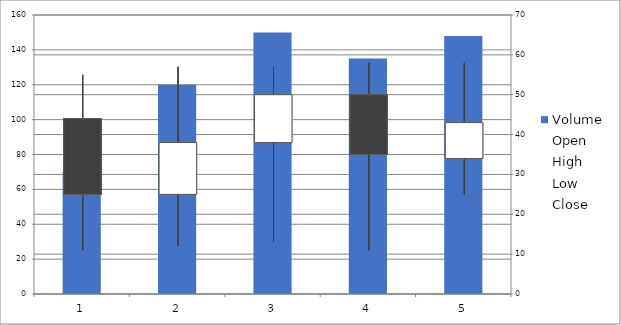
| Category | Volume |
|---|---|
| 1900-01-01 | 70 |
| 1900-01-02 | 120 |
| 1900-01-03 | 150 |
| 1900-01-04 | 135 |
| 1900-01-05 | 148 |